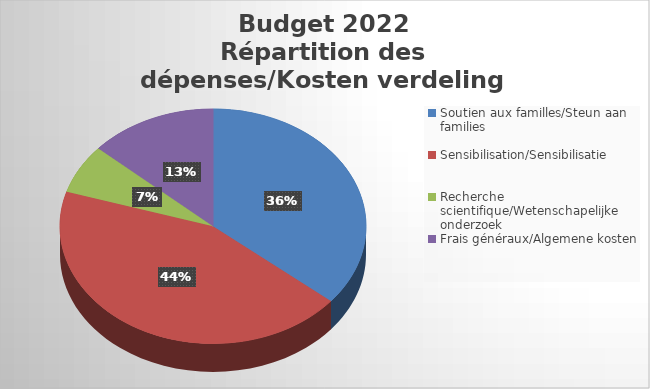
| Category | Series 0 |
|---|---|
| Soutien aux familles/Steun aan families | 1594377 |
| Sensibilisation/Sensibilisatie | 1936229 |
| Recherche scientifique/Wetenschapelijke onderzoek | 300263 |
| Frais généraux/Algemene kosten | 596115 |